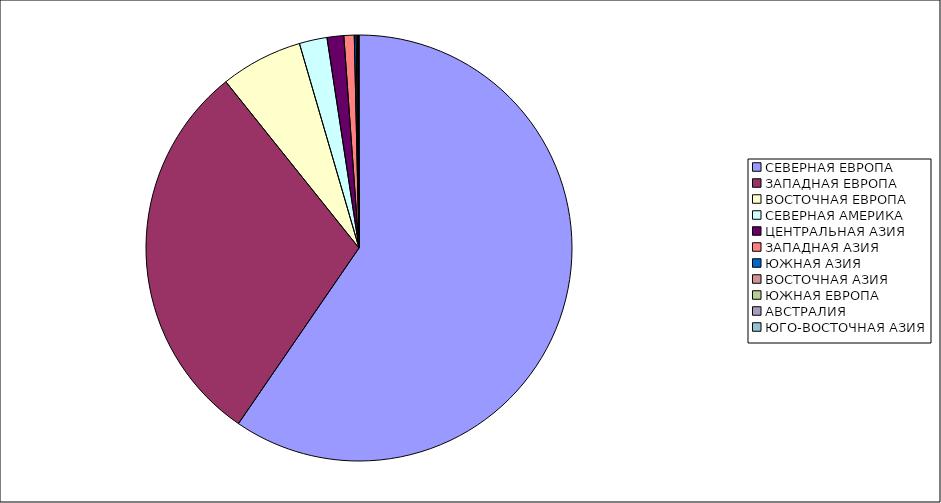
| Category | Оборот |
|---|---|
| СЕВЕРНАЯ ЕВРОПА | 59.573 |
| ЗАПАДНАЯ ЕВРОПА | 29.678 |
| ВОСТОЧНАЯ ЕВРОПА | 6.237 |
| СЕВЕРНАЯ АМЕРИКА | 2.105 |
| ЦЕНТРАЛЬНАЯ АЗИЯ | 1.269 |
| ЗАПАДНАЯ АЗИЯ | 0.784 |
| ЮЖНАЯ АЗИЯ | 0.14 |
| ВОСТОЧНАЯ АЗИЯ | 0.104 |
| ЮЖНАЯ ЕВРОПА | 0.05 |
| АВСТРАЛИЯ | 0.035 |
| ЮГО-ВОСТОЧНАЯ АЗИЯ | 0.024 |